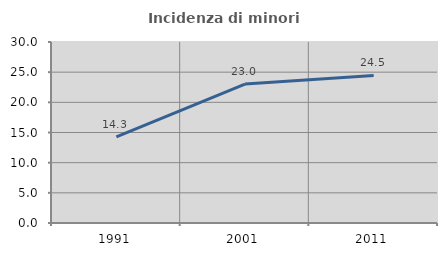
| Category | Incidenza di minori stranieri |
|---|---|
| 1991.0 | 14.286 |
| 2001.0 | 23.034 |
| 2011.0 | 24.466 |